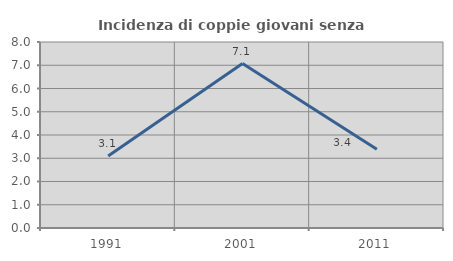
| Category | Incidenza di coppie giovani senza figli |
|---|---|
| 1991.0 | 3.093 |
| 2001.0 | 7.071 |
| 2011.0 | 3.39 |